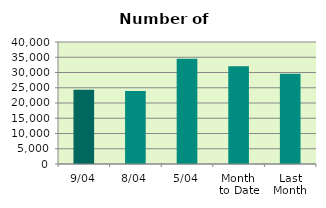
| Category | Series 0 |
|---|---|
| 9/04 | 24316 |
| 8/04 | 23936 |
| 5/04 | 34544 |
| Month 
to Date | 32052.857 |
| Last
Month | 29553.143 |